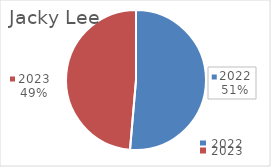
| Category | Jacky Lee |
|---|---|
| 2022 | 2711156 |
| 2023 | 2566978 |